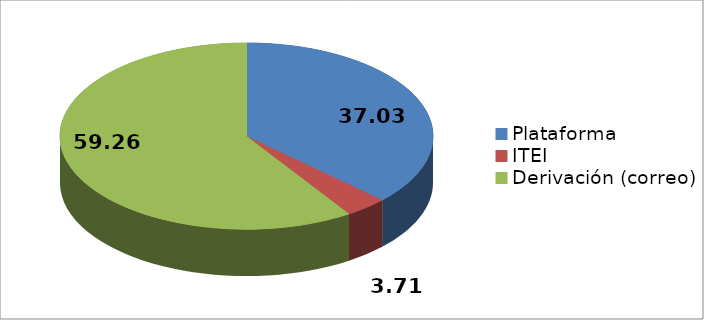
| Category | Series 0 | Series 1 |
|---|---|---|
| Plataforma | 10 | 0.37 |
| ITEI | 1 | 0.037 |
| Derivación (correo) | 16 | 0.593 |